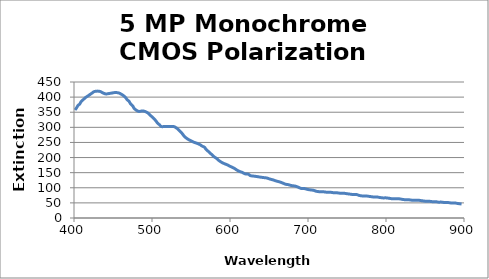
| Category | Extinction Ratio |
|---|---|
| 401.32 | 357.33 |
| 403.077 | 363.58 |
| 404.834 | 371.4 |
| 407.47 | 377.65 |
| 409.227 | 385.47 |
| 411.863 | 391.72 |
| 414.499 | 397.97 |
| 417.135 | 402.66 |
| 420.649 | 408.91 |
| 423.285 | 413.6 |
| 425.921 | 418.29 |
| 430.314 | 419.86 |
| 433.828 | 418.29 |
| 437.343 | 413.6 |
| 440.857 | 410.48 |
| 445.25 | 412.04 |
| 448.765 | 413.6 |
| 453.158 | 415.17 |
| 457.551 | 413.6 |
| 461.065 | 408.91 |
| 463.701 | 404.23 |
| 466.337 | 397.97 |
| 468.094 | 391.72 |
| 470.73 | 385.47 |
| 472.487 | 377.65 |
| 475.123 | 371.4 |
| 476.88 | 363.58 |
| 479.516 | 357.33 |
| 483.03 | 352.64 |
| 487.423 | 354.2 |
| 490.938 | 352.64 |
| 494.452 | 347.95 |
| 497.088 | 341.7 |
| 499.724 | 335.45 |
| 502.36 | 329.19 |
| 504.996 | 321.38 |
| 506.753 | 315.12 |
| 509.389 | 308.87 |
| 512.024 | 302.62 |
| 515.539 | 302.62 |
| 519.053 | 302.62 |
| 523.446 | 302.62 |
| 527.839 | 302.62 |
| 531.354 | 297.93 |
| 533.99 | 291.68 |
| 536.625 | 285.42 |
| 539.261 | 277.61 |
| 541.018 | 271.36 |
| 543.654 | 265.1 |
| 546.29 | 260.41 |
| 549.804 | 255.72 |
| 553.319 | 251.03 |
| 556.833 | 247.91 |
| 561.226 | 243.22 |
| 563.862 | 238.53 |
| 567.377 | 233.84 |
| 569.134 | 227.59 |
| 571.77 | 221.33 |
| 574.405 | 215.08 |
| 577.041 | 208.83 |
| 579.677 | 202.58 |
| 583.191 | 196.32 |
| 585.827 | 190.07 |
| 588.463 | 185.38 |
| 591.978 | 180.69 |
| 596.371 | 176 |
| 599.885 | 171.31 |
| 602.521 | 168.19 |
| 606.035 | 163.5 |
| 608.671 | 158.81 |
| 612.185 | 154.12 |
| 615.7 | 150.99 |
| 619.214 | 146.3 |
| 623.607 | 144.74 |
| 626.243 | 140.05 |
| 630.636 | 138.49 |
| 635.029 | 136.92 |
| 638.544 | 135.36 |
| 642.937 | 133.8 |
| 647.33 | 132.23 |
| 650.844 | 129.11 |
| 655.237 | 125.98 |
| 658.752 | 122.85 |
| 663.145 | 119.73 |
| 666.659 | 116.6 |
| 671.052 | 111.91 |
| 674.566 | 110.35 |
| 678.96 | 107.22 |
| 683.353 | 105.66 |
| 686.867 | 102.53 |
| 691.26 | 97.84 |
| 694.774 | 97.84 |
| 699.167 | 94.72 |
| 702.682 | 93.15 |
| 707.075 | 91.59 |
| 710.589 | 88.46 |
| 714.982 | 86.9 |
| 719.375 | 86.9 |
| 723.768 | 85.34 |
| 728.161 | 85.34 |
| 732.554 | 83.77 |
| 736.069 | 83.77 |
| 740.462 | 82.21 |
| 744.855 | 82.21 |
| 749.248 | 80.65 |
| 753.641 | 79.08 |
| 758.034 | 77.52 |
| 762.427 | 77.52 |
| 765.942 | 74.39 |
| 770.335 | 72.83 |
| 774.728 | 72.83 |
| 779.121 | 71.27 |
| 783.514 | 69.71 |
| 787.907 | 69.71 |
| 791.421 | 68.14 |
| 795.814 | 66.58 |
| 800.207 | 66.58 |
| 804.6 | 65.02 |
| 808.115 | 63.45 |
| 812.508 | 63.45 |
| 816.901 | 63.45 |
| 820.415 | 61.89 |
| 824.808 | 60.33 |
| 829.201 | 60.33 |
| 833.594 | 58.76 |
| 837.987 | 58.76 |
| 841.502 | 58.76 |
| 845.895 | 57.2 |
| 850.288 | 55.64 |
| 854.681 | 55.64 |
| 859.074 | 54.07 |
| 863.467 | 54.07 |
| 866.981 | 52.51 |
| 871.374 | 52.51 |
| 875.767 | 50.95 |
| 880.16 | 50.95 |
| 884.553 | 49.38 |
| 888.946 | 49.38 |
| 892.461 | 47.82 |
| 896.854 | 46.26 |